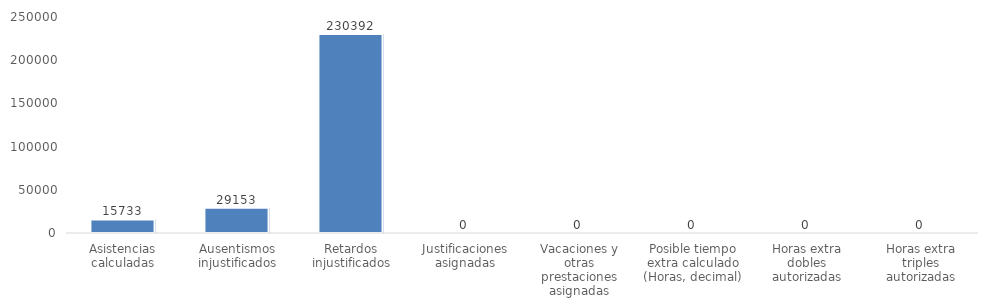
| Category | Radiografia de configuracion |
|---|---|
| Asistencias calculadas | 15733 |
| Ausentismos injustificados | 29153 |
| Retardos injustificados | 230392 |
| Justificaciones asignadas | 0 |
| Vacaciones y otras prestaciones asignadas | 0 |
| Posible tiempo extra calculado (Horas, decimal) | 0 |
| Horas extra dobles autorizadas | 0 |
| Horas extra triples autorizadas | 0 |